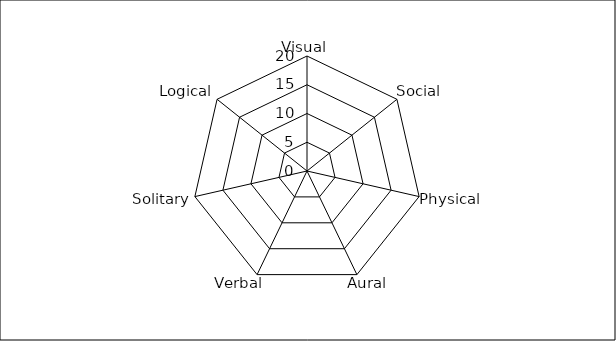
| Category | Series 0 |
|---|---|
| Visual | 0 |
| Social | 0 |
| Physical | 0 |
| Aural | 0 |
| Verbal | 0 |
| Solitary | 0 |
| Logical | 0 |